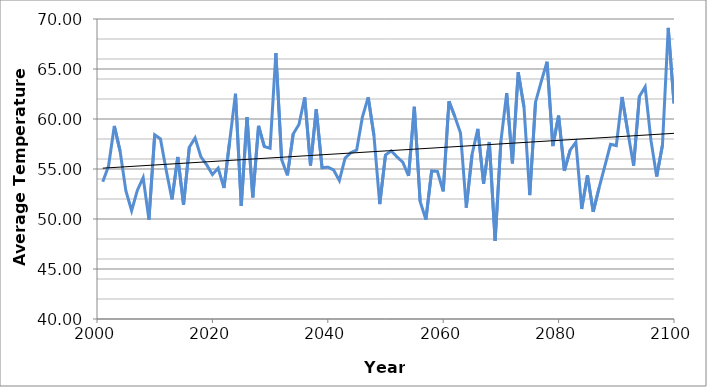
| Category | B1 |
|---|---|
| 2001.0 | 53.726 |
| 2002.0 | 55.297 |
| 2003.0 | 59.306 |
| 2004.0 | 56.786 |
| 2005.0 | 52.83 |
| 2006.0 | 50.828 |
| 2007.0 | 52.885 |
| 2008.0 | 54.136 |
| 2009.0 | 49.933 |
| 2010.0 | 58.426 |
| 2011.0 | 58.008 |
| 2012.0 | 54.849 |
| 2013.0 | 51.958 |
| 2014.0 | 56.196 |
| 2015.0 | 51.426 |
| 2016.0 | 57.178 |
| 2017.0 | 58.107 |
| 2018.0 | 56.228 |
| 2019.0 | 55.423 |
| 2020.0 | 54.446 |
| 2021.0 | 55.087 |
| 2022.0 | 53.1 |
| 2023.0 | 57.801 |
| 2024.0 | 62.528 |
| 2025.0 | 51.318 |
| 2026.0 | 60.192 |
| 2027.0 | 52.165 |
| 2028.0 | 59.32 |
| 2029.0 | 57.24 |
| 2030.0 | 57.079 |
| 2031.0 | 66.601 |
| 2032.0 | 55.938 |
| 2033.0 | 54.365 |
| 2034.0 | 58.498 |
| 2035.0 | 59.452 |
| 2036.0 | 62.164 |
| 2037.0 | 55.351 |
| 2038.0 | 60.969 |
| 2039.0 | 55.123 |
| 2040.0 | 55.186 |
| 2041.0 | 54.907 |
| 2042.0 | 53.85 |
| 2043.0 | 56.086 |
| 2044.0 | 56.635 |
| 2045.0 | 56.892 |
| 2046.0 | 60.201 |
| 2047.0 | 62.172 |
| 2048.0 | 58.343 |
| 2049.0 | 51.49 |
| 2050.0 | 56.403 |
| 2051.0 | 56.815 |
| 2052.0 | 56.203 |
| 2053.0 | 55.681 |
| 2054.0 | 54.306 |
| 2055.0 | 61.223 |
| 2056.0 | 51.762 |
| 2057.0 | 49.942 |
| 2058.0 | 54.824 |
| 2059.0 | 54.772 |
| 2060.0 | 52.761 |
| 2061.0 | 61.777 |
| 2062.0 | 60.265 |
| 2063.0 | 58.602 |
| 2064.0 | 51.145 |
| 2065.0 | 56.446 |
| 2066.0 | 59.02 |
| 2067.0 | 53.537 |
| 2068.0 | 57.702 |
| 2069.0 | 47.82 |
| 2070.0 | 57.767 |
| 2071.0 | 62.589 |
| 2072.0 | 55.571 |
| 2073.0 | 64.675 |
| 2074.0 | 61.209 |
| 2075.0 | 52.38 |
| 2076.0 | 61.682 |
| 2077.0 | 63.754 |
| 2078.0 | 65.727 |
| 2079.0 | 57.297 |
| 2080.0 | 60.337 |
| 2081.0 | 54.81 |
| 2082.0 | 56.887 |
| 2083.0 | 57.688 |
| 2084.0 | 51.008 |
| 2085.0 | 54.369 |
| 2086.0 | 50.72 |
| 2087.0 | 53.092 |
| 2088.0 | 55.267 |
| 2089.0 | 57.466 |
| 2090.0 | 57.342 |
| 2091.0 | 62.195 |
| 2092.0 | 58.69 |
| 2093.0 | 55.337 |
| 2094.0 | 62.253 |
| 2095.0 | 63.208 |
| 2096.0 | 57.886 |
| 2097.0 | 54.244 |
| 2098.0 | 57.385 |
| 2099.0 | 69.116 |
| 2100.0 | 61.56 |